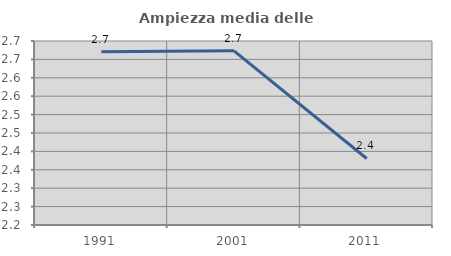
| Category | Ampiezza media delle famiglie |
|---|---|
| 1991.0 | 2.671 |
| 2001.0 | 2.673 |
| 2011.0 | 2.381 |